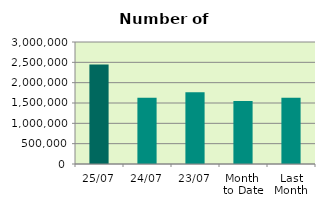
| Category | Series 0 |
|---|---|
| 25/07 | 2446092 |
| 24/07 | 1627954 |
| 23/07 | 1762480 |
| Month 
to Date | 1548972.211 |
| Last
Month | 1630183.4 |